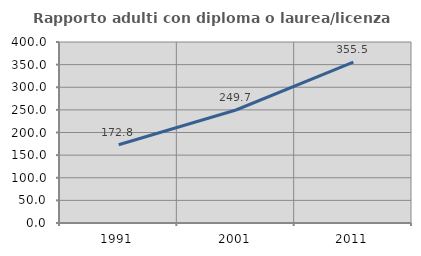
| Category | Rapporto adulti con diploma o laurea/licenza media  |
|---|---|
| 1991.0 | 172.803 |
| 2001.0 | 249.737 |
| 2011.0 | 355.466 |